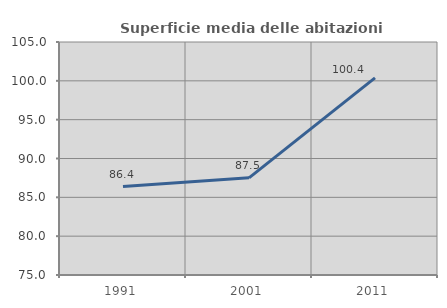
| Category | Superficie media delle abitazioni occupate |
|---|---|
| 1991.0 | 86.379 |
| 2001.0 | 87.513 |
| 2011.0 | 100.377 |